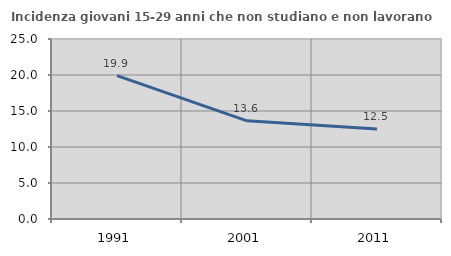
| Category | Incidenza giovani 15-29 anni che non studiano e non lavorano  |
|---|---|
| 1991.0 | 19.917 |
| 2001.0 | 13.636 |
| 2011.0 | 12.5 |